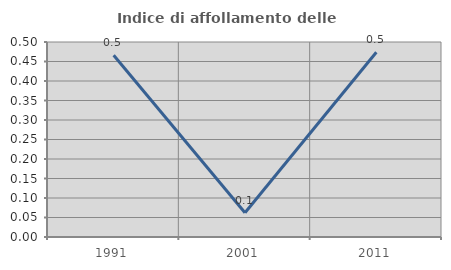
| Category | Indice di affollamento delle abitazioni  |
|---|---|
| 1991.0 | 0.466 |
| 2001.0 | 0.062 |
| 2011.0 | 0.474 |